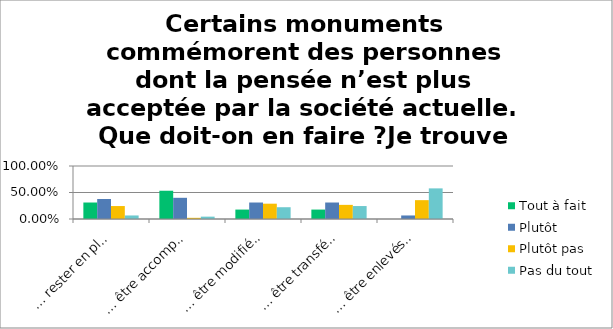
| Category | Tout à fait | Plutôt | Plutôt pas | Pas du tout |
|---|---|---|---|---|
| … rester en place dans leur forme actuelle, à titre de témoins de leur époque. | 0.311 | 0.378 | 0.244 | 0.067 |
| … être accompagnés d’une pancarte qui explique la problématique. | 0.533 | 0.4 | 0.022 | 0.044 |
| … être modifiés de façon à mettre clairement en lumière la problématique (par exemple à l’aide d’un contre-monument). | 0.178 | 0.311 | 0.289 | 0.222 |
| … être transférés au musée et expliqués. | 0.178 | 0.311 | 0.267 | 0.244 |
| … être enlevés et ne plus être publiquement accessibles. | 0 | 0.067 | 0.356 | 0.578 |